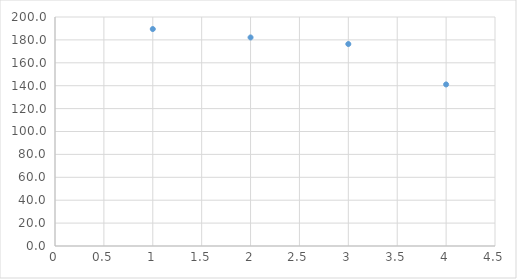
| Category | Series 0 |
|---|---|
| 1.0 | 189.476 |
| 2.0 | 182.143 |
| 3.0 | 176.392 |
| 4.0 | 141.102 |